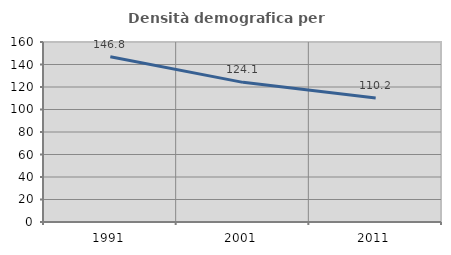
| Category | Densità demografica |
|---|---|
| 1991.0 | 146.813 |
| 2001.0 | 124.125 |
| 2011.0 | 110.19 |